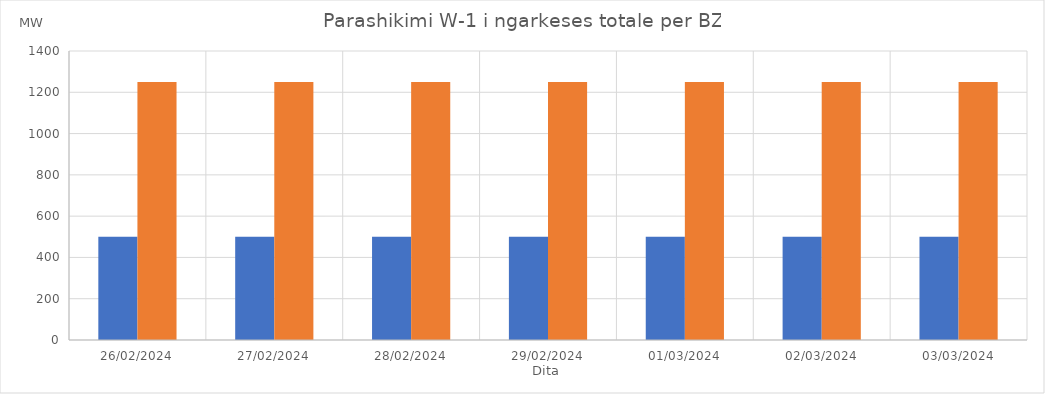
| Category | Min (MW) | Max (MW) |
|---|---|---|
| 26/02/2024 | 500 | 1250 |
| 27/02/2024 | 500 | 1250 |
| 28/02/2024 | 500 | 1250 |
| 29/02/2024 | 500 | 1250 |
| 01/03/2024 | 500 | 1250 |
| 02/03/2024 | 500 | 1250 |
| 03/03/2024 | 500 | 1250 |